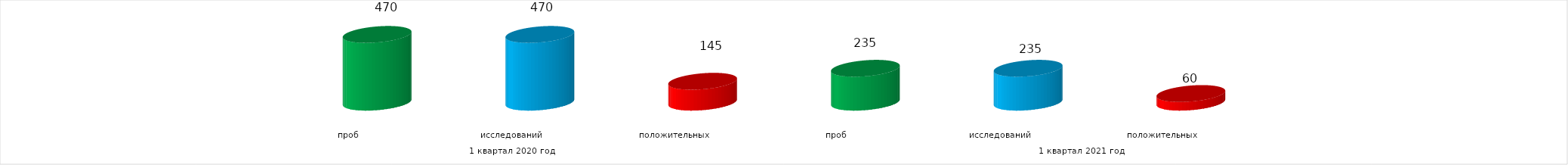
| Category | Series 4 |
|---|---|
| 0 | 470 |
| 1 | 470 |
| 2 | 145 |
| 3 | 235 |
| 4 | 235 |
| 5 | 60 |